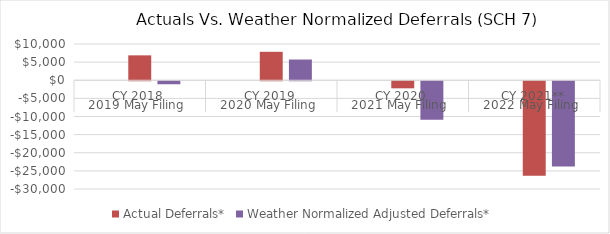
| Category | Residential: SCH 7 | Actual Deferrals* | Weather Normalized Adjusted Deferrals* |
|---|---|---|---|
| 0 |  | 6868.361 | -830.036 |
| 1 |  | 7847.929 | 5717.106 |
| 2 |  | -1952.047 | -10620.88 |
| 3 |  | -26076.977 | -23510.988 |